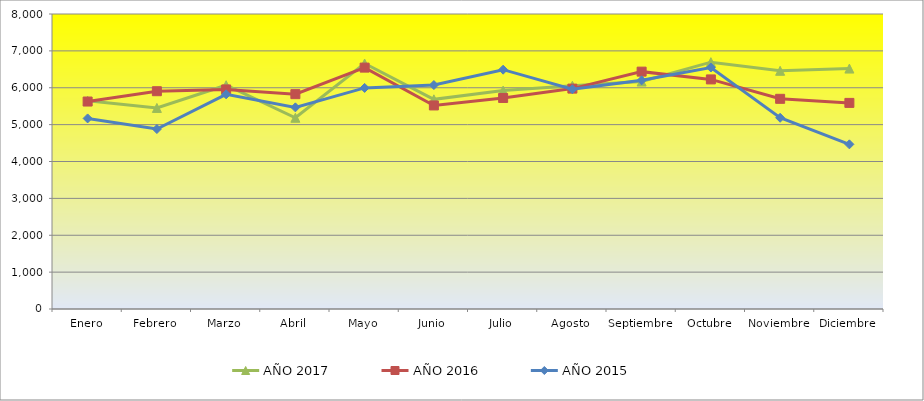
| Category | AÑO 2017 | AÑO 2016 | AÑO 2015 |
|---|---|---|---|
| Enero | 5648.571 | 5626 | 5168 |
| Febrero | 5452.857 | 5906 | 4880 |
| Marzo | 6068.571 | 5954 | 5821 |
| Abril | 5185.714 | 5826 | 5468 |
| Mayo | 6657.143 | 6546 | 5996 |
| Junio | 5685.714 | 5520 | 6073 |
| Julio | 5922.857 | 5723 | 6490 |
| Agosto | 6054.286 | 5977 | 5960 |
| Septiembre | 6168.571 | 6437 | 6201 |
| Octubre | 6693.659 | 6226 | 6549 |
| Noviembre | 6459.512 | 5700 | 5186 |
| Diciembre | 6520 | 5589 | 4465 |